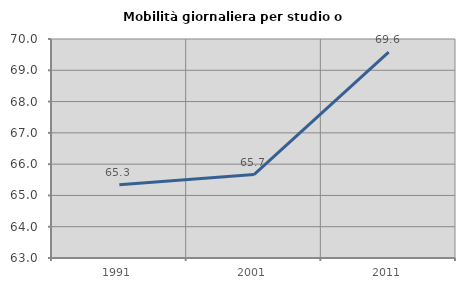
| Category | Mobilità giornaliera per studio o lavoro |
|---|---|
| 1991.0 | 65.339 |
| 2001.0 | 65.666 |
| 2011.0 | 69.581 |